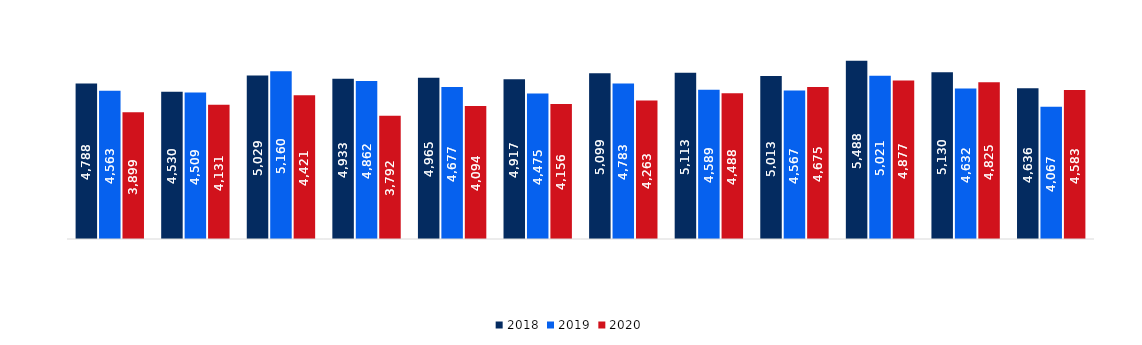
| Category | 2018 | 2019 | 2020 |
|---|---|---|---|
| styczeń/ January | 4787.804 | 4562.946 | 3899.331 |
| luty/ February | 4530.087 | 4509.029 | 4130.677 |
| marzec/ March | 5029.029 | 5160.058 | 4421.45 |
| kwiecień/April | 4932.923 | 4861.751 | 3791.813 |
| maj/May | 4965.366 | 4677.394 | 4094.009 |
| czerwiec/June | 4916.98 | 4475.499 | 4155.739 |
| lipiec/July | 5099.447 | 4782.539 | 4263.277 |
| sierpień/August | 5112.616 | 4588.68 | 4488.241 |
| wrzesień/September | 5013.421 | 4566.941 | 4674.582 |
| październik/October | 5487.73 | 5020.825 | 4876.993 |
| listopad/November | 5130.307 | 4632.425 | 4824.506 |
| grudzień/December | 4636.323 | 4067.371 | 4582.775 |